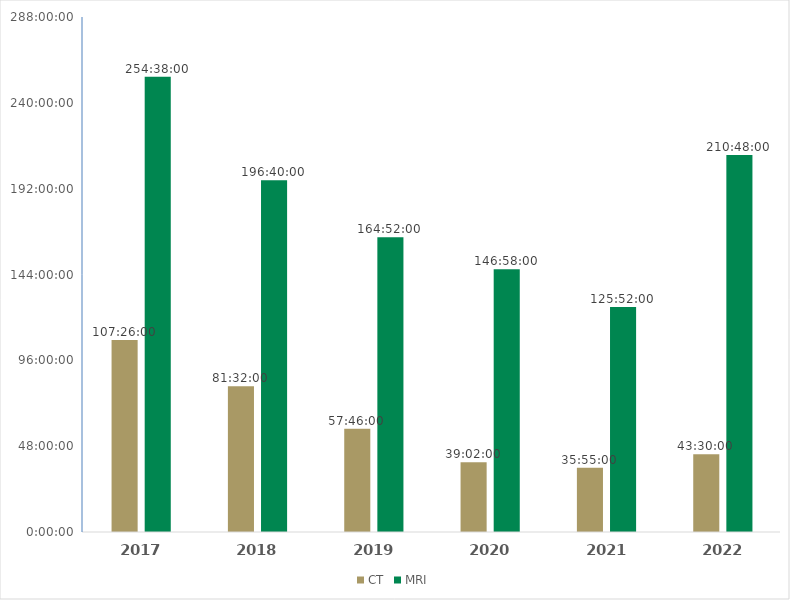
| Category | CT | MRI |
|---|---|---|
| 2017.0 | 1900-01-04 11:26:00 | 1900-01-10 14:38:00 |
| 2018.0 | 1900-01-03 09:32:00 | 1900-01-08 04:40:00 |
| 2019.0 | 1900-01-02 09:46:00 | 1900-01-06 20:52:00 |
| 2020.0 | 1900-01-01 15:02:00 | 1900-01-06 02:58:00 |
| 2021.0 | 1900-01-01 11:55:00 | 1900-01-05 05:52:00 |
| 2022.0 | 1900-01-01 19:30:00 | 1900-01-08 18:48:00 |